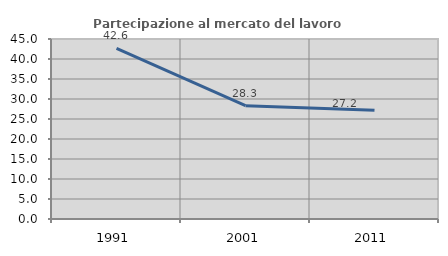
| Category | Partecipazione al mercato del lavoro  femminile |
|---|---|
| 1991.0 | 42.634 |
| 2001.0 | 28.323 |
| 2011.0 | 27.176 |